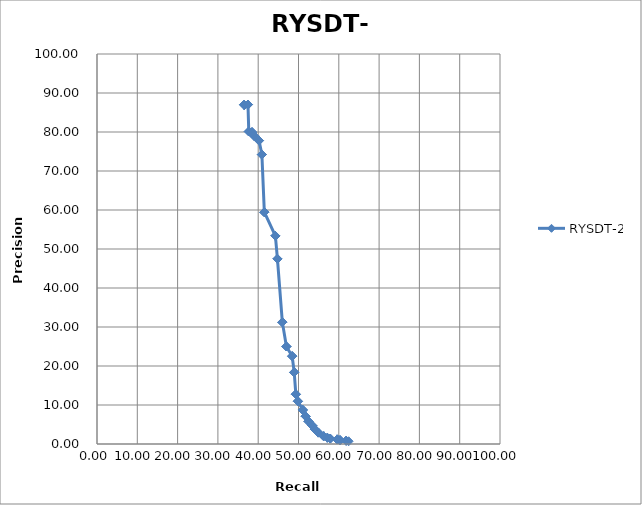
| Category | RYSDT-2 |
|---|---|
| 36.548 | 86.957 |
| 36.548 | 86.957 |
| 36.548 | 86.957 |
| 36.548 | 86.957 |
| 36.548 | 86.957 |
| 36.548 | 86.957 |
| 36.548 | 86.957 |
| 36.548 | 86.957 |
| 36.548 | 86.957 |
| 36.548 | 86.957 |
| 37.462 | 87.028 |
| 37.462 | 87.028 |
| 37.462 | 87.028 |
| 37.462 | 87.028 |
| 37.665 | 80.13 |
| 37.665 | 80.13 |
| 37.665 | 80.13 |
| 38.477 | 79.958 |
| 38.477 | 79.958 |
| 38.477 | 79.958 |
| 38.985 | 79.012 |
| 38.985 | 79.012 |
| 38.985 | 79.012 |
| 38.985 | 79.012 |
| 40.203 | 77.8 |
| 40.203 | 77.8 |
| 40.203 | 77.8 |
| 40.914 | 74.217 |
| 40.914 | 74.217 |
| 40.914 | 74.217 |
| 41.523 | 59.448 |
| 41.523 | 59.448 |
| 41.523 | 59.448 |
| 41.523 | 59.448 |
| 44.264 | 53.366 |
| 44.264 | 53.366 |
| 44.264 | 53.366 |
| 44.772 | 47.47 |
| 44.772 | 47.47 |
| 44.772 | 47.47 |
| 45.99 | 31.241 |
| 45.99 | 31.241 |
| 45.99 | 31.241 |
| 45.99 | 31.241 |
| 47.005 | 25 |
| 47.005 | 25 |
| 47.005 | 25 |
| 48.426 | 22.532 |
| 48.426 | 22.532 |
| 48.426 | 22.532 |
| 48.934 | 18.397 |
| 48.934 | 18.397 |
| 48.934 | 18.397 |
| 48.934 | 18.397 |
| 49.34 | 12.766 |
| 49.34 | 12.766 |
| 49.34 | 12.766 |
| 49.848 | 10.965 |
| 49.848 | 10.965 |
| 49.848 | 10.965 |
| 51.066 | 8.722 |
| 51.066 | 8.722 |
| 51.066 | 8.722 |
| 51.066 | 8.722 |
| 51.777 | 7.118 |
| 51.777 | 7.118 |
| 51.777 | 7.118 |
| 52.487 | 5.802 |
| 52.487 | 5.802 |
| 52.487 | 5.802 |
| 53.401 | 4.729 |
| 53.401 | 4.729 |
| 53.401 | 4.729 |
| 53.401 | 4.729 |
| 54.01 | 3.832 |
| 54.01 | 3.832 |
| 54.01 | 3.832 |
| 54.924 | 2.923 |
| 54.924 | 2.923 |
| 54.924 | 2.923 |
| 56.244 | 1.987 |
| 56.244 | 1.987 |
| 56.244 | 1.987 |
| 56.244 | 1.987 |
| 57.157 | 1.609 |
| 57.157 | 1.609 |
| 57.157 | 1.609 |
| 57.868 | 1.394 |
| 57.868 | 1.394 |
| 57.868 | 1.394 |
| 59.594 | 1.18 |
| 59.594 | 1.18 |
| 59.594 | 1.18 |
| 59.594 | 1.18 |
| 60.305 | 0.987 |
| 60.305 | 0.987 |
| 60.305 | 0.987 |
| 61.827 | 0.838 |
| 61.827 | 0.838 |
| 61.827 | 0.838 |
| 62.437 | 0.704 |